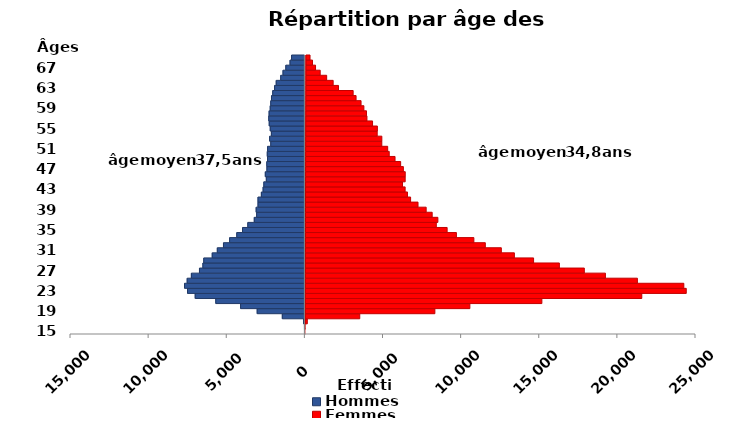
| Category | âge  | Hommes | Femmes |
|---|---|---|---|
| 15.0 | 15 | 0 | 1 |
| 16.0 | 16 | -21 | 28 |
| 17.0 | 17 | -88 | 170 |
| 18.0 | 18 | -1444 | 3526 |
| 19.0 | 19 | -3052 | 8332 |
| 20.0 | 20 | -4113 | 10571 |
| 21.0 | 21 | -5702 | 15178 |
| 22.0 | 22 | -7019 | 21572 |
| 23.0 | 23 | -7512 | 24417 |
| 24.0 | 24 | -7703 | 24260 |
| 25.0 | 25 | -7532 | 21288 |
| 26.0 | 26 | -7264 | 19240 |
| 27.0 | 27 | -6746 | 17889 |
| 28.0 | 28 | -6527 | 16291 |
| 29.0 | 29 | -6471 | 14640 |
| 30.0 | 30 | -5929 | 13410 |
| 31.0 | 31 | -5604 | 12574 |
| 32.0 | 32 | -5210 | 11548 |
| 33.0 | 33 | -4816 | 10814 |
| 34.0 | 34 | -4359 | 9696 |
| 35.0 | 35 | -3991 | 9101 |
| 36.0 | 36 | -3652 | 8407 |
| 37.0 | 37 | -3238 | 8506 |
| 38.0 | 38 | -3086 | 8141 |
| 39.0 | 39 | -3117 | 7755 |
| 40.0 | 40 | -2999 | 7233 |
| 41.0 | 41 | -2999 | 6757 |
| 42.0 | 42 | -2784 | 6556 |
| 43.0 | 43 | -2673 | 6405 |
| 44.0 | 44 | -2626 | 6237 |
| 45.0 | 45 | -2467 | 6406 |
| 46.0 | 46 | -2532 | 6409 |
| 47.0 | 47 | -2429 | 6288 |
| 48.0 | 48 | -2437 | 6113 |
| 49.0 | 49 | -2390 | 5753 |
| 50.0 | 50 | -2406 | 5380 |
| 51.0 | 51 | -2386 | 5280 |
| 52.0 | 52 | -2183 | 4903 |
| 53.0 | 53 | -2256 | 4904 |
| 54.0 | 54 | -2143 | 4606 |
| 55.0 | 55 | -2216 | 4617 |
| 56.0 | 56 | -2281 | 4307 |
| 57.0 | 57 | -2311 | 3947 |
| 58.0 | 58 | -2289 | 3916 |
| 59.0 | 59 | -2218 | 3749 |
| 60.0 | 60 | -2184 | 3567 |
| 61.0 | 61 | -2137 | 3247 |
| 62.0 | 62 | -2057 | 3059 |
| 63.0 | 63 | -1940 | 2122 |
| 64.0 | 64 | -1834 | 1778 |
| 65.0 | 65 | -1546 | 1361 |
| 66.0 | 66 | -1399 | 946 |
| 67.0 | 67 | -1219 | 647 |
| 68.0 | 68 | -949 | 452 |
| 69.0 | 69 | -852 | 293 |